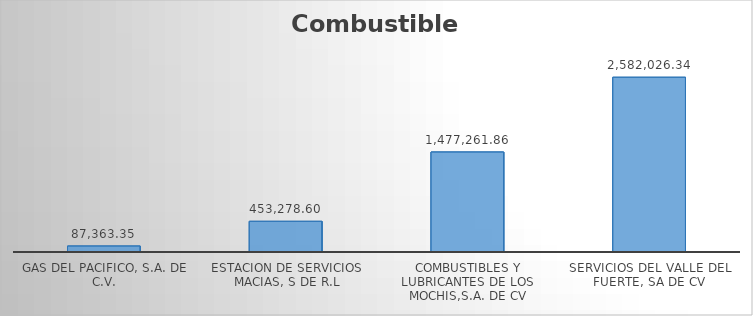
| Category | SUMA |
|---|---|
| GAS DEL PACIFICO, S.A. DE C.V. | 87363.35 |
| ESTACION DE SERVICIOS MACIAS, S DE R.L | 453278.6 |
| COMBUSTIBLES Y LUBRICANTES DE LOS MOCHIS,S.A. DE CV | 1477261.86 |
| SERVICIOS DEL VALLE DEL FUERTE, SA DE CV | 2582026.34 |